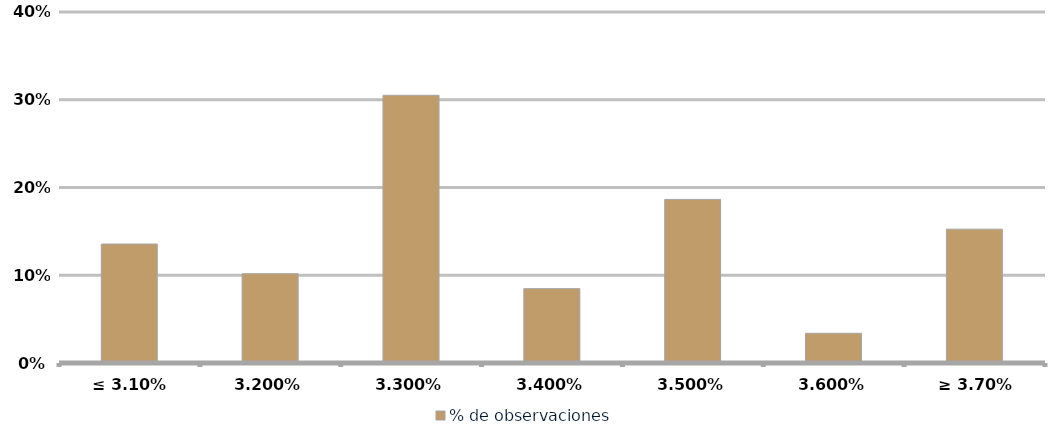
| Category | % de observaciones  |
|---|---|
| ≤ 3.10% | 0.136 |
| 3,20% | 0.102 |
| 3,30% | 0.305 |
| 3,40% | 0.085 |
| 3,50% | 0.186 |
| 3,60% | 0.034 |
| ≥ 3.70% | 0.153 |